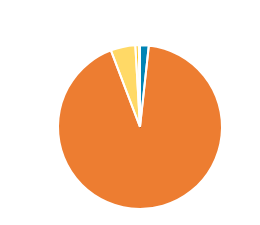
| Category | Series 0 |
|---|---|
| PC/MC | 113 |
| CAR/LGV | 6086 |
| OGV1 & PSV 2Axle | 320 |
| OGV1 & PSV 3 Axle | 44 |
| OGV2 | 16 |